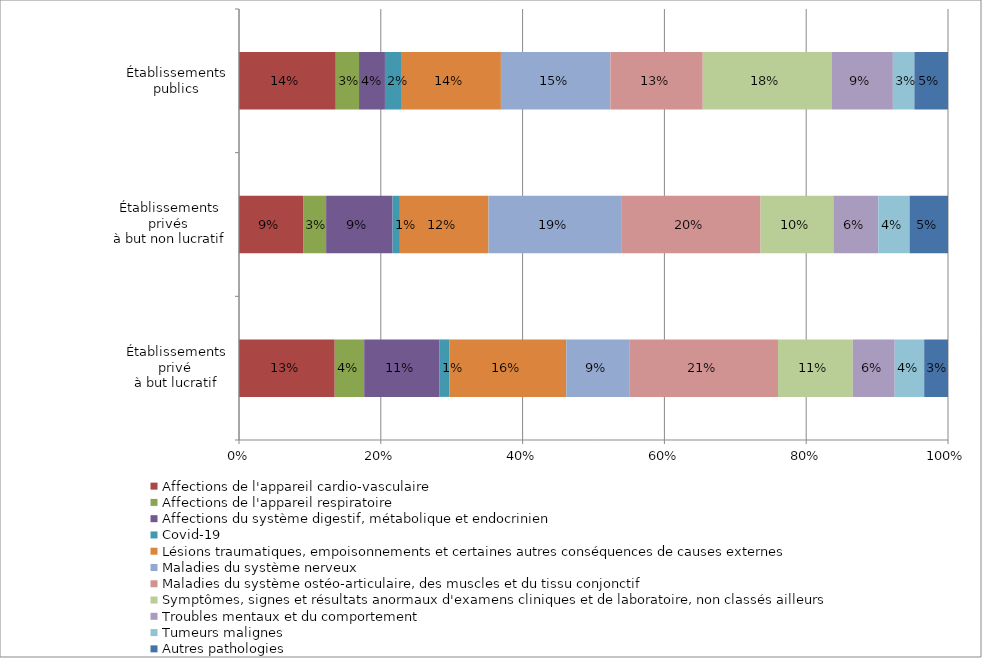
| Category | Affections de l'appareil cardio-vasculaire | Affections de l'appareil respiratoire | Affections du système digestif, métabolique et endocrinien | Covid-19 | Lésions traumatiques, empoisonnements et certaines autres conséquences de causes externes | Maladies du système nerveux | Maladies du système ostéo-articulaire, des muscles et du tissu conjonctif | Symptômes, signes et résultats anormaux d'examens cliniques et de laboratoire, non classés ailleurs | Troubles mentaux et du comportement | Tumeurs malignes | Autres pathologies |
|---|---|---|---|---|---|---|---|---|---|---|---|
| Établissements privé 
à but lucratif | 0.135 | 0.042 | 0.106 | 0.014 | 0.164 | 0.089 | 0.21 | 0.105 | 0.059 | 0.042 | 0.034 |
| Établissements privés 
à but non lucratif | 0.09 | 0.032 | 0.094 | 0.01 | 0.125 | 0.188 | 0.196 | 0.103 | 0.063 | 0.044 | 0.054 |
| Établissements publics | 0.136 | 0.033 | 0.037 | 0.024 | 0.14 | 0.154 | 0.13 | 0.182 | 0.086 | 0.03 | 0.047 |